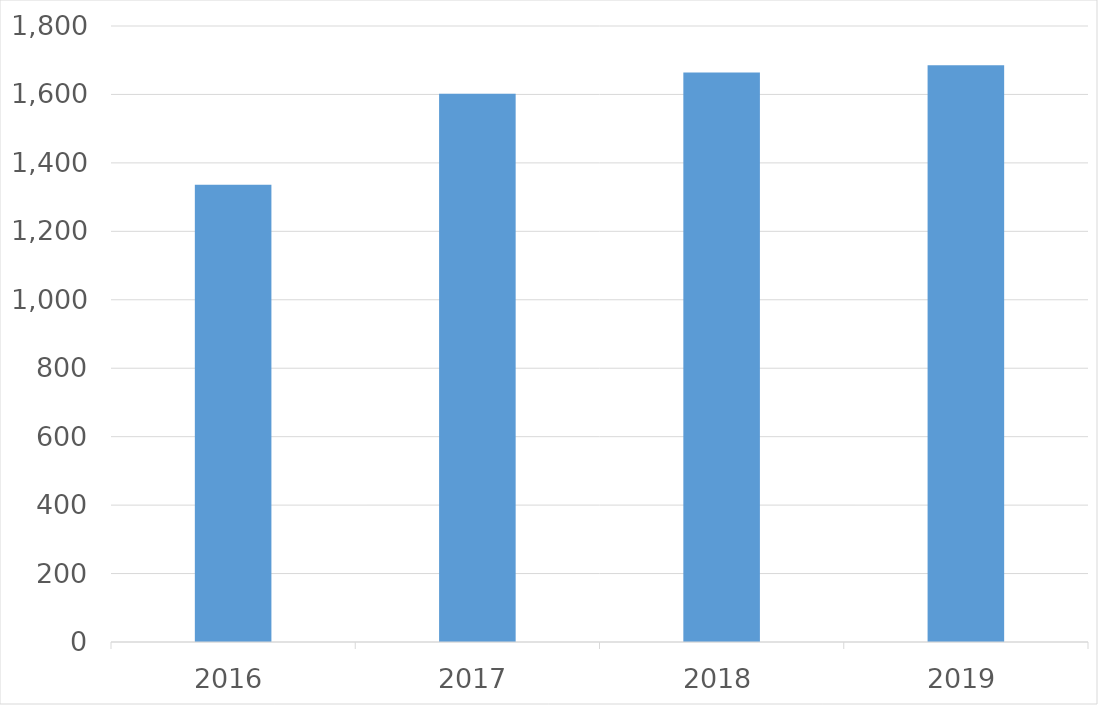
| Category | Series 0 |
|---|---|
| 2016 | 1336 |
| 2017 | 1602 |
| 2018 | 1664 |
| 2019 | 1685 |